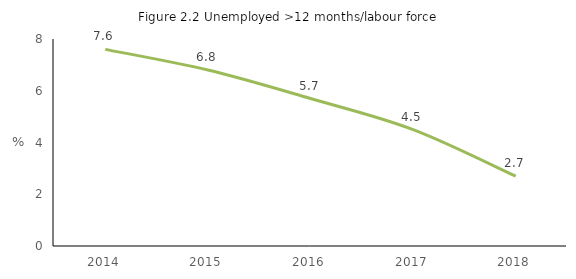
| Category | >12 months/labour force |
|---|---|
| 2014.0 | 7.6 |
| 2015.0 | 6.8 |
| 2016.0 | 5.7 |
| 2017.0 | 4.5 |
| 2018.0 | 2.7 |